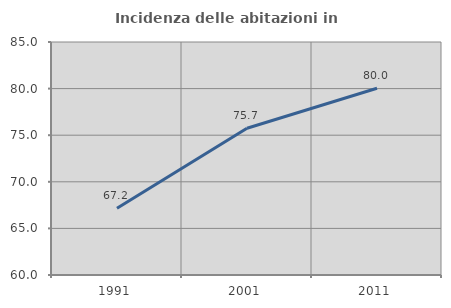
| Category | Incidenza delle abitazioni in proprietà  |
|---|---|
| 1991.0 | 67.157 |
| 2001.0 | 75.748 |
| 2011.0 | 80.033 |